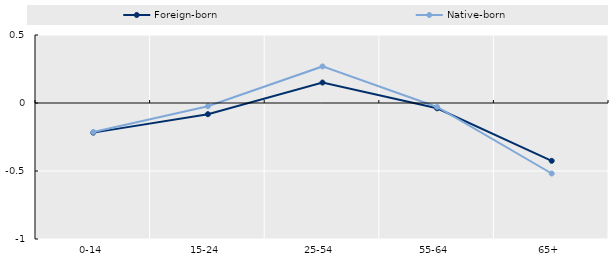
| Category | Foreign-born | Native-born |
|---|---|---|
| 0-14 | -0.218 | -0.214 |
| 15-24 | -0.082 | -0.024 |
| 25-54 | 0.15 | 0.269 |
| 55-64 | -0.039 | -0.029 |
| 65+ | -0.425 | -0.518 |